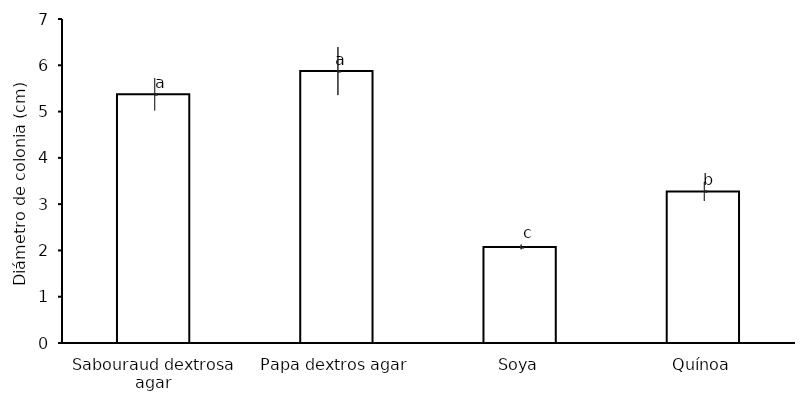
| Category | Media |
|---|---|
| Sabouraud dextrosa agar | 5.375 |
| Papa dextros agar | 5.875 |
| Soya | 2.075 |
| Quínoa | 3.275 |